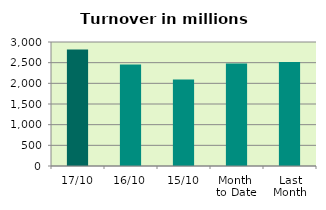
| Category | Series 0 |
|---|---|
| 17/10 | 2819.397 |
| 16/10 | 2453.566 |
| 15/10 | 2091.222 |
| Month 
to Date | 2479.854 |
| Last
Month | 2513.15 |